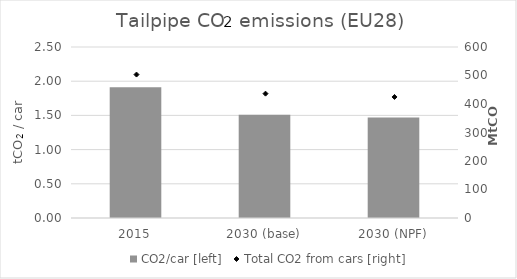
| Category | CO2/car [left] |
|---|---|
| 2015 | 1.91 |
| 2030 (base) | 1.509 |
| 2030 (NPF) | 1.468 |